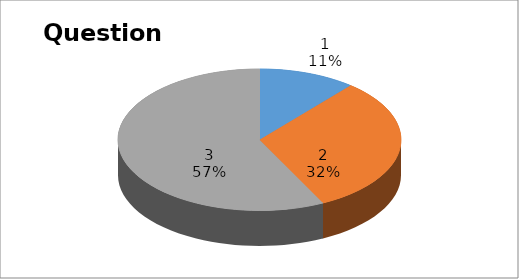
| Category | Series 0 |
|---|---|
| 0 | 6 |
| 1 | 17 |
| 2 | 31 |